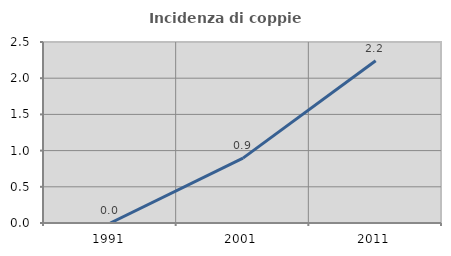
| Category | Incidenza di coppie miste |
|---|---|
| 1991.0 | 0 |
| 2001.0 | 0.896 |
| 2011.0 | 2.242 |